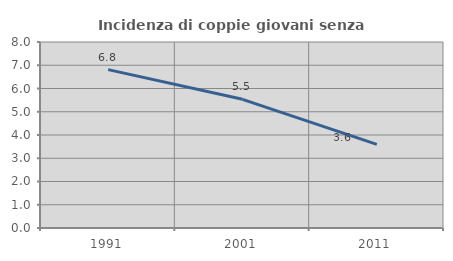
| Category | Incidenza di coppie giovani senza figli |
|---|---|
| 1991.0 | 6.812 |
| 2001.0 | 5.534 |
| 2011.0 | 3.598 |